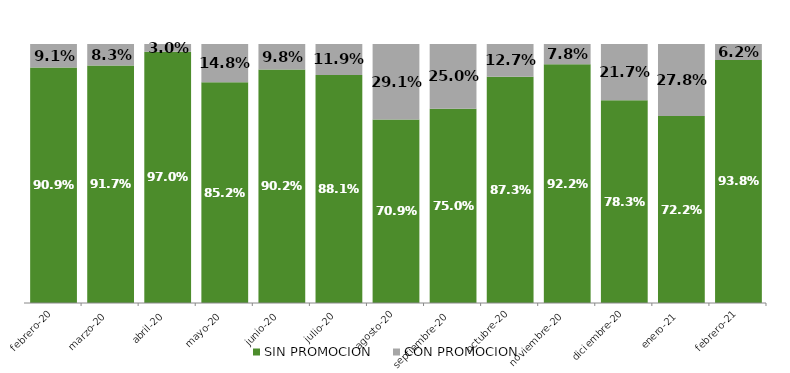
| Category | SIN PROMOCION   | CON PROMOCION   |
|---|---|---|
| 2020-02-01 | 0.909 | 0.091 |
| 2020-03-01 | 0.917 | 0.083 |
| 2020-04-01 | 0.97 | 0.03 |
| 2020-05-01 | 0.852 | 0.148 |
| 2020-06-01 | 0.902 | 0.098 |
| 2020-07-01 | 0.881 | 0.119 |
| 2020-08-01 | 0.709 | 0.291 |
| 2020-09-01 | 0.75 | 0.25 |
| 2020-10-01 | 0.873 | 0.127 |
| 2020-11-01 | 0.922 | 0.078 |
| 2020-12-01 | 0.783 | 0.217 |
| 2021-01-01 | 0.722 | 0.278 |
| 2021-02-01 | 0.938 | 0.062 |